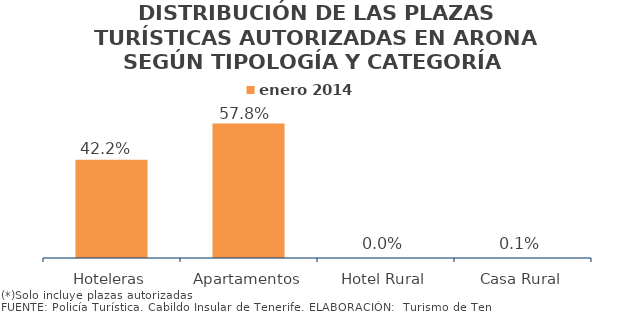
| Category | enero 2014 |
|---|---|
| Hoteleras | 0.422 |
| Apartamentos | 0.578 |
| Hotel Rural | 0 |
| Casa Rural | 0.001 |